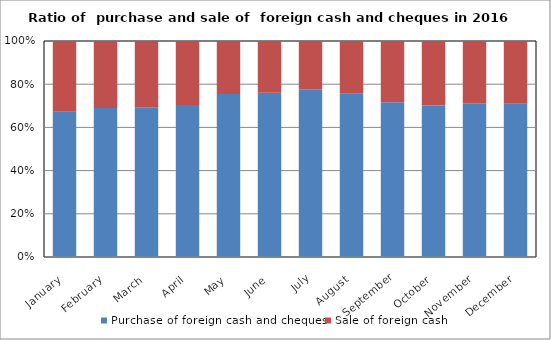
| Category | Purchase of foreign cash and cheques | Sale of foreign cash  |
|---|---|---|
| January | 957330421 | 466848800 |
| February | 1076056200 | 483397581 |
| March | 1272624289 | 561829302 |
| April | 1298895813 | 547876125 |
| May | 1912661676 | 622833727 |
| June | 2028016944 | 639920495 |
| July | 3086192347 | 887325683 |
| August | 3441410667 | 1113442867 |
| September | 1900515242 | 753538954 |
| October | 1468983122 | 626270860 |
| November | 1273093298 | 516302806 |
| December | 1504206833 | 615385360 |